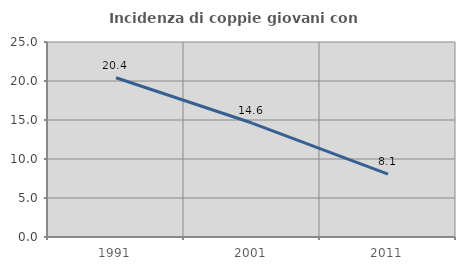
| Category | Incidenza di coppie giovani con figli |
|---|---|
| 1991.0 | 20.423 |
| 2001.0 | 14.61 |
| 2011.0 | 8.068 |